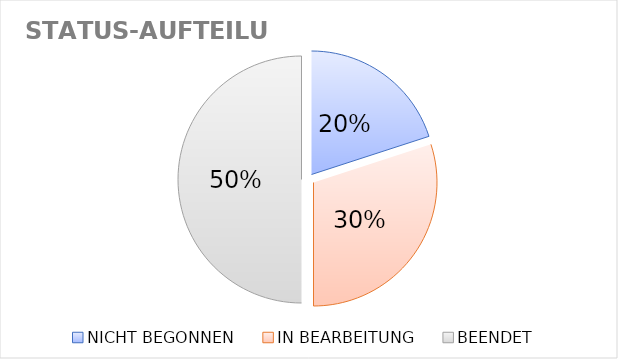
| Category | Series 0 |
|---|---|
| NICHT BEGONNEN | 2 |
| IN BEARBEITUNG | 3 |
| BEENDET | 5 |